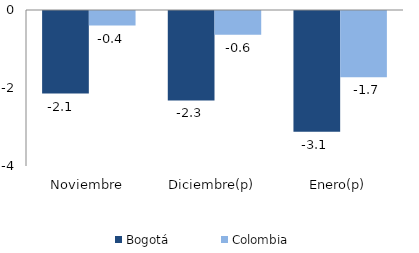
| Category | Bogotá | Colombia |
|---|---|---|
| Noviembre | -2.117 | -0.373 |
| Diciembre(p) | -2.295 | -0.612 |
| Enero(p) | -3.098 | -1.696 |